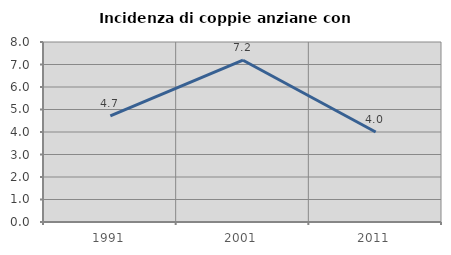
| Category | Incidenza di coppie anziane con figli |
|---|---|
| 1991.0 | 4.72 |
| 2001.0 | 7.19 |
| 2011.0 | 4 |